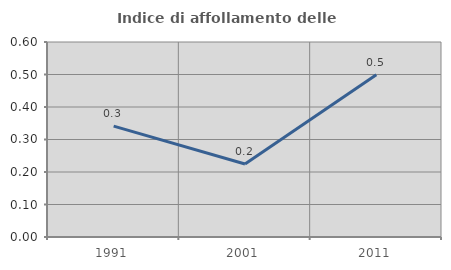
| Category | Indice di affollamento delle abitazioni  |
|---|---|
| 1991.0 | 0.341 |
| 2001.0 | 0.225 |
| 2011.0 | 0.499 |